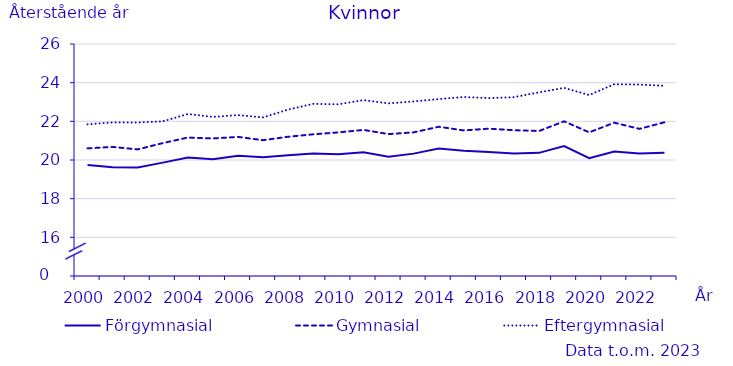
| Category | Förgymnasial | Gymnasial | Eftergymnasial |
|---|---|---|---|
| 2000.0 | 19.737 | 20.601 | 21.846 |
| 2001.0 | 19.624 | 20.677 | 21.944 |
| 2002.0 | 19.609 | 20.548 | 21.939 |
| 2003.0 | 19.865 | 20.875 | 21.999 |
| 2004.0 | 20.123 | 21.162 | 22.379 |
| 2005.0 | 20.042 | 21.115 | 22.229 |
| 2006.0 | 20.22 | 21.194 | 22.322 |
| 2007.0 | 20.147 | 21.025 | 22.203 |
| 2008.0 | 20.24 | 21.203 | 22.608 |
| 2009.0 | 20.336 | 21.329 | 22.906 |
| 2010.0 | 20.295 | 21.427 | 22.88 |
| 2011.0 | 20.401 | 21.557 | 23.097 |
| 2012.0 | 20.17 | 21.34 | 22.93 |
| 2013.0 | 20.33 | 21.43 | 23.03 |
| 2014.0 | 20.59 | 21.72 | 23.15 |
| 2015.0 | 20.48 | 21.53 | 23.26 |
| 2016.0 | 20.41 | 21.62 | 23.2 |
| 2017.0 | 20.34 | 21.54 | 23.25 |
| 2018.0 | 20.37 | 21.5 | 23.5 |
| 2019.0 | 20.72 | 22 | 23.73 |
| 2020.0 | 20.09 | 21.43 | 23.36 |
| 2021.0 | 20.44 | 21.93 | 23.92 |
| 2022.0 | 20.33 | 21.61 | 23.9 |
| 2023.0 | 20.38 | 21.95 | 23.84 |